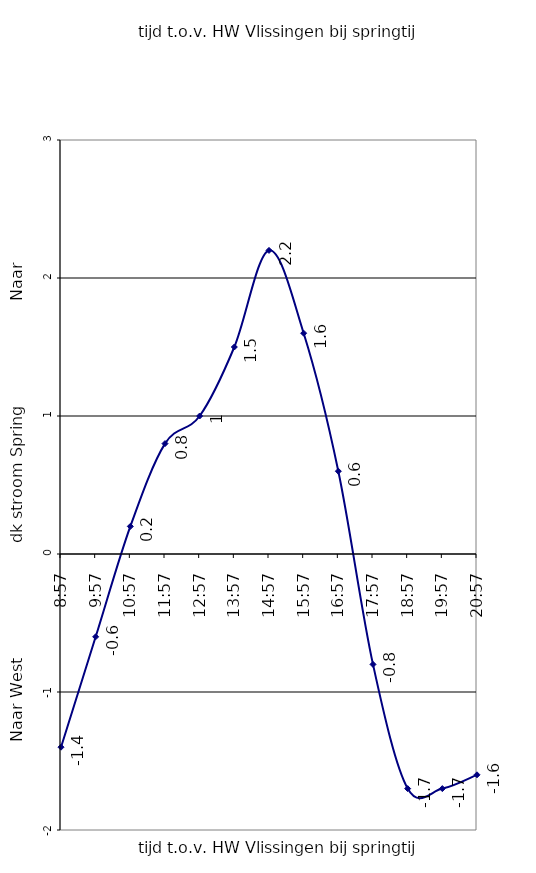
| Category | Series 0 |
|---|---|
| 1900-01-06 08:57:00 | -1.4 |
| 1900-01-05 09:57:00 | -0.6 |
| 1900-01-04 10:57:00 | 0.2 |
| 1900-01-03 11:57:00 | 0.8 |
| 1900-01-02 12:57:00 | 1 |
| 1900-01-01 13:57:00 | 1.5 |
| 0.6229166666666667 | 2.2 |
| 1900-01-01 15:57:00 | 1.6 |
| 1900-01-02 16:57:00 | 0.6 |
| 1900-01-03 17:57:00 | -0.8 |
| 1900-01-04 18:57:00 | -1.7 |
| 1900-01-05 19:57:00 | -1.7 |
| 1900-01-06 20:57:00 | -1.6 |